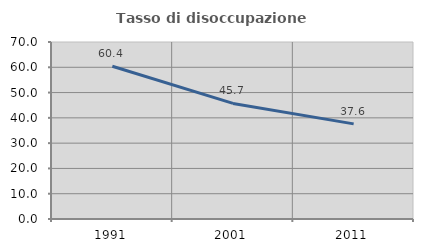
| Category | Tasso di disoccupazione giovanile  |
|---|---|
| 1991.0 | 60.392 |
| 2001.0 | 45.704 |
| 2011.0 | 37.619 |